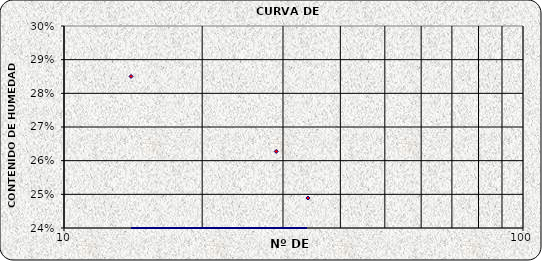
| Category | Series 0 |
|---|---|
| 34.0 | 0.249 |
| 29.0 | 0.263 |
| 14.0 | 0.285 |